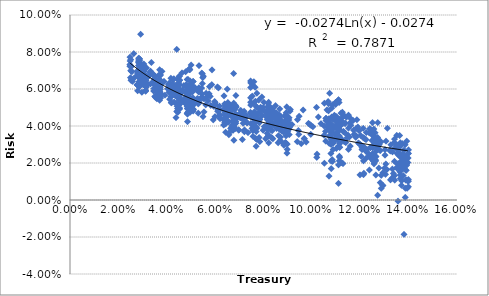
| Category | Series 0 |
|---|---|
| 0.09396559139784944 | 0.032 |
| 0.09403763440860213 | 0.043 |
| 0.09445053763440854 | 0.038 |
| 0.09475215053763439 | 0.045 |
| 0.09560322580645159 | 0.03 |
| 0.09634193548387092 | 0.049 |
| 0.09676881720430103 | 0.033 |
| 0.09692419354838705 | 0.033 |
| 0.09860860215053767 | 0.041 |
| 0.09914032258064519 | 0.041 |
| 0.09952956989247315 | 0.035 |
| 0.10042795698924738 | 0.04 |
| 0.102089247311828 | 0.025 |
| 0.10265591397849466 | 0.045 |
| 0.1051494623655914 | 0.02 |
| 0.10564462365591397 | 0.037 |
| 0.10572150537634405 | 0.032 |
| 0.10627903225806448 | 0.049 |
| 0.10661881720430101 | 0.039 |
| 0.10675215053763439 | 0.053 |
| 0.10717526881720427 | 0.031 |
| 0.10744516129032258 | 0.035 |
| 0.1078010752688172 | 0.037 |
| 0.10794247311827959 | 0.021 |
| 0.10795752688172046 | 0.03 |
| 0.10795376344086022 | 0.033 |
| 0.10794408602150536 | 0.034 |
| 0.10804892473118279 | 0.017 |
| 0.10816559139784947 | 0.04 |
| 0.10846344086021509 | 0.022 |
| 0.10877311827956991 | 0.027 |
| 0.10877311827956991 | 0.031 |
| 0.10900376344086023 | 0.031 |
| 0.10985053763440858 | 0.04 |
| 0.1105806451612903 | 0.034 |
| 0.1105806451612903 | 0.034 |
| 0.11093494623655914 | 0.029 |
| 0.11098064516129033 | 0.041 |
| 0.11098064516129033 | 0.041 |
| 0.11103709677419356 | 0.009 |
| 0.11103709677419356 | 0.019 |
| 0.11117311827956994 | 0.034 |
| 0.11119677419354843 | 0.039 |
| 0.11127903225806456 | 0.032 |
| 0.11136182795698926 | 0.021 |
| 0.11138118279569896 | 0.044 |
| 0.11133387096774199 | 0.024 |
| 0.11126290322580645 | 0.035 |
| 0.11127913978494623 | 0.053 |
| 0.11141290322580642 | 0.043 |
| 0.1115395698924731 | 0.03 |
| 0.1115395698924731 | 0.032 |
| 0.1115579569892473 | 0.028 |
| 0.11148344086021504 | 0.023 |
| 0.11139290322580646 | 0.029 |
| 0.1113468817204301 | 0.034 |
| 0.11133086021505377 | 0.034 |
| 0.11130225806451613 | 0.032 |
| 0.1113751612903226 | 0.038 |
| 0.11201602150537632 | 0.04 |
| 0.1123567741935484 | 0.02 |
| 0.1133904301075269 | 0.032 |
| 0.11402591397849463 | 0.031 |
| 0.1160887096774193 | 0.04 |
| 0.11749021505376339 | 0.036 |
| 0.11825258064516124 | 0.035 |
| 0.11919032258064512 | 0.031 |
| 0.12131913978494621 | 0.014 |
| 0.12131913978494621 | 0.021 |
| 0.12148806451612901 | 0.015 |
| 0.12148806451612901 | 0.029 |
| 0.12378913978494624 | 0.016 |
| 0.12463139784946238 | 0.022 |
| 0.12580430107526883 | 0.034 |
| 0.12605032258064514 | 0.021 |
| 0.12645838709677418 | 0.014 |
| 0.1269874193548387 | 0.033 |
| 0.12722150537634408 | 0.042 |
| 0.12783924731182797 | 0.03 |
| 0.12829451612903225 | 0.009 |
| 0.12829451612903225 | 0.027 |
| 0.12867344086021507 | 0.006 |
| 0.12867344086021507 | 0.013 |
| 0.12936462365591406 | 0.008 |
| 0.12936462365591406 | 0.008 |
| 0.12936462365591406 | 0.015 |
| 0.13022741935483875 | 0.024 |
| 0.130461935483871 | 0.014 |
| 0.13056892473118284 | 0.019 |
| 0.13248827956989254 | 0.011 |
| 0.13264150537634414 | 0.03 |
| 0.1331436559139785 | 0.012 |
| 0.13333290322580646 | 0.026 |
| 0.13367591397849463 | 0.014 |
| 0.13433129032258068 | 0.028 |
| 0.1350533333333333 | 0.017 |
| 0.1350533333333333 | 0.03 |
| 0.1350533333333333 | 0.035 |
| 0.13546677419354836 | 0.02 |
| 0.13562161290322577 | -0.001 |
| 0.13603397849462365 | 0.029 |
| 0.1362990322580645 | 0.017 |
| 0.1364264516129032 | 0.015 |
| 0.13649043010752687 | 0.014 |
| 0.136628064516129 | 0.016 |
| 0.136628064516129 | 0.024 |
| 0.136628064516129 | 0.024 |
| 0.13660010752688168 | 0.031 |
| 0.1366017204301075 | 0.02 |
| 0.1366017204301075 | 0.023 |
| 0.1369936559139784 | 0.021 |
| 0.1371108602150537 | 0.01 |
| 0.13722806451612896 | 0.02 |
| 0.13722806451612896 | 0.023 |
| 0.1375033333333333 | 0.022 |
| 0.1375033333333333 | 0.025 |
| 0.13754903225806447 | 0.017 |
| 0.1380576344086022 | -0.019 |
| 0.1384420430107527 | 0.024 |
| 0.13852752688172046 | 0.03 |
| 0.138567311827957 | 0.001 |
| 0.1386221505376344 | 0.024 |
| 0.13875333333333337 | 0.016 |
| 0.13880225806451615 | 0.011 |
| 0.13880225806451615 | 0.019 |
| 0.13887107526881723 | 0.021 |
| 0.13913666666666671 | 0.02 |
| 0.13917483870967745 | 0.011 |
| 0.13922537634408605 | 0.032 |
| 0.13972000000000007 | 0.02 |
| 0.1398216129032259 | 0.023 |
| 0.13983774193548398 | 0.025 |
| 0.13989419354838717 | 0.01 |
| 0.13991247311827967 | 0.025 |
| 0.1399033333333334 | 0.011 |
| 0.1399033333333334 | 0.027 |
| 0.13989365591397854 | 0.007 |
| 0.13970064516129035 | 0.01 |
| 0.13935548387096777 | 0.006 |
| 0.13921193548387098 | 0.019 |
| 0.1390689247311828 | 0.019 |
| 0.13902698924731183 | 0.016 |
| 0.1389447311827957 | 0.024 |
| 0.13864580645161292 | 0.006 |
| 0.13847913978494625 | 0.022 |
| 0.1380941935483871 | 0.017 |
| 0.13806731182795698 | 0.027 |
| 0.13785924731182794 | 0.018 |
| 0.13785924731182794 | 0.022 |
| 0.1377968817204301 | 0.013 |
| 0.1374796774193548 | 0.031 |
| 0.13707430107526875 | 0.008 |
| 0.13674741935483867 | 0.024 |
| 0.13657591397849458 | 0.012 |
| 0.1363759139784946 | 0.019 |
| 0.13630494623655912 | 0.029 |
| 0.13624473118279568 | 0.035 |
| 0.13590924731182796 | 0.024 |
| 0.13583720430107527 | 0.027 |
| 0.13566784946236557 | 0.019 |
| 0.1354721505376344 | 0.025 |
| 0.13523827956989246 | 0.025 |
| 0.13510494623655914 | 0.017 |
| 0.1342861290322581 | 0.011 |
| 0.13415978494623657 | 0.013 |
| 0.13415978494623657 | 0.021 |
| 0.13415978494623657 | 0.031 |
| 0.13415978494623657 | 0.033 |
| 0.1340183870967742 | 0.031 |
| 0.13327591397849464 | 0.017 |
| 0.13253075268817202 | 0.026 |
| 0.13216731182795702 | 0.027 |
| 0.13118989247311832 | 0.039 |
| 0.13101731182795706 | 0.016 |
| 0.13065064516129035 | 0.032 |
| 0.13024258064516134 | 0.027 |
| 0.13001946236559145 | 0.017 |
| 0.1285581720430108 | 0.031 |
| 0.12785118279569896 | 0.027 |
| 0.12767322580645166 | 0.017 |
| 0.12767322580645166 | 0.033 |
| 0.12721247311827963 | 0.003 |
| 0.12721247311827963 | 0.028 |
| 0.12721247311827963 | 0.028 |
| 0.12721247311827963 | 0.029 |
| 0.12721247311827963 | 0.033 |
| 0.12721247311827963 | 0.034 |
| 0.12675924731182797 | 0.027 |
| 0.12626569892473122 | 0.031 |
| 0.12577860215053766 | 0.034 |
| 0.1256151612903226 | 0.038 |
| 0.12515602150537636 | 0.037 |
| 0.1250167741935484 | 0.025 |
| 0.12485655913978497 | 0.032 |
| 0.12416731182795698 | 0.028 |
| 0.12416731182795698 | 0.028 |
| 0.12399580645161286 | 0.039 |
| 0.12399580645161286 | 0.039 |
| 0.1225065591397849 | 0.036 |
| 0.12235279569892468 | 0.033 |
| 0.12177591397849455 | 0.028 |
| 0.12125279569892464 | 0.034 |
| 0.12125279569892464 | 0.039 |
| 0.12071516129032252 | 0.028 |
| 0.1205872043010752 | 0.029 |
| 0.11967215053763434 | 0.03 |
| 0.11832322580645155 | 0.039 |
| 0.11781354838709668 | 0.035 |
| 0.11610494623655905 | 0.044 |
| 0.11554311827956981 | 0.034 |
| 0.11516086021505367 | 0.039 |
| 0.11516086021505367 | 0.046 |
| 0.11496569892473109 | 0.035 |
| 0.11287806451612897 | 0.02 |
| 0.1108259139784946 | 0.04 |
| 0.11051569892473116 | 0.043 |
| 0.10986731182795702 | 0.045 |
| 0.10890709677419359 | 0.04 |
| 0.1083018817204302 | 0.032 |
| 0.1081443010752689 | 0.037 |
| 0.10794139784946243 | 0.037 |
| 0.10779505376344091 | 0.041 |
| 0.10729258064516135 | 0.034 |
| 0.10729258064516135 | 0.058 |
| 0.10706639784946244 | 0.038 |
| 0.10695215053763445 | 0.041 |
| 0.10695215053763445 | 0.052 |
| 0.10691349462365597 | 0.041 |
| 0.10688301075268822 | 0.043 |
| 0.10685973118279574 | 0.048 |
| 0.10703715053763442 | 0.043 |
| 0.10703715053763442 | 0.044 |
| 0.10814 | 0.045 |
| 0.10820096774193548 | 0.05 |
| 0.10851983870967742 | 0.051 |
| 0.10867994623655913 | 0.039 |
| 0.10867994623655913 | 0.044 |
| 0.10895048387096774 | 0.039 |
| 0.10927994623655915 | 0.046 |
| 0.10960876344086021 | 0.035 |
| 0.10971489247311826 | 0.033 |
| 0.1098221505376344 | 0.052 |
| 0.1098221505376344 | 0.053 |
| 0.1098221505376344 | 0.053 |
| 0.11024279569892476 | 0.045 |
| 0.1104378494623656 | 0.042 |
| 0.1106521505376344 | 0.037 |
| 0.11069473118279567 | 0.038 |
| 0.11069473118279567 | 0.043 |
| 0.11101967741935483 | 0.037 |
| 0.11101967741935483 | 0.054 |
| 0.11101967741935483 | 0.054 |
| 0.11172736559139783 | 0.033 |
| 0.11206607526881714 | 0.047 |
| 0.1121313978494623 | 0.041 |
| 0.1121945161290322 | 0.033 |
| 0.1121945161290322 | 0.043 |
| 0.11261064516129024 | 0.041 |
| 0.11261064516129024 | 0.047 |
| 0.11273779569892466 | 0.045 |
| 0.11298408602150531 | 0.037 |
| 0.1130496774193548 | 0.037 |
| 0.11344779569892469 | 0.046 |
| 0.11365569892473114 | 0.041 |
| 0.11385806451612901 | 0.041 |
| 0.11424043010752685 | 0.045 |
| 0.11515704301075266 | 0.027 |
| 0.11585403225806452 | 0.029 |
| 0.1170204301075269 | 0.043 |
| 0.11729591397849459 | 0.038 |
| 0.11814333333333325 | 0.034 |
| 0.11859752688172027 | 0.043 |
| 0.1190339784946235 | 0.039 |
| 0.11989930107526872 | 0.014 |
| 0.11999048387096764 | 0.03 |
| 0.1203923118279569 | 0.024 |
| 0.12187559139784936 | 0.033 |
| 0.12374500000000002 | 0.036 |
| 0.1250882795698925 | 0.042 |
| 0.1251630107526882 | 0.028 |
| 0.12541596774193556 | 0.023 |
| 0.1254927419354839 | 0.021 |
| 0.1256723655913979 | 0.02 |
| 0.12571951612903232 | 0.022 |
| 0.12580419354838715 | 0.03 |
| 0.12602795698924737 | 0.03 |
| 0.12602795698924737 | 0.033 |
| 0.12617365591397856 | 0.036 |
| 0.12627672043010757 | 0.022 |
| 0.12637241935483876 | 0.021 |
| 0.12640064516129035 | 0.029 |
| 0.1265313978494624 | 0.023 |
| 0.12651817204301075 | 0.028 |
| 0.12643897849462363 | 0.024 |
| 0.12630161290322578 | 0.033 |
| 0.12602005376344083 | 0.029 |
| 0.12547505376344087 | 0.025 |
| 0.12535381720430108 | 0.025 |
| 0.12507301075268812 | 0.032 |
| 0.12507301075268812 | 0.037 |
| 0.12496930107526878 | 0.035 |
| 0.12368913978494624 | 0.024 |
| 0.12322650537634408 | 0.025 |
| 0.12264811827956988 | 0.027 |
| 0.12242532258064516 | 0.023 |
| 0.12242532258064516 | 0.026 |
| 0.12153290322580648 | 0.033 |
| 0.12076252688172048 | 0.027 |
| 0.12013881720430113 | 0.035 |
| 0.11955005376344088 | 0.037 |
| 0.11578150537634413 | 0.042 |
| 0.11457193548387096 | 0.034 |
| 0.11381080645161293 | 0.036 |
| 0.11258682795698925 | 0.032 |
| 0.11108693548387094 | 0.034 |
| 0.11102290322580645 | 0.033 |
| 0.11067672043010753 | 0.042 |
| 0.11031629032258061 | 0.043 |
| 0.11020870967741933 | 0.035 |
| 0.11014870967741931 | 0.028 |
| 0.11014870967741931 | 0.035 |
| 0.10909715053763439 | 0.043 |
| 0.10853327956989244 | 0.021 |
| 0.10806607526881722 | 0.041 |
| 0.10785451612903227 | 0.025 |
| 0.10708467741935485 | 0.013 |
| 0.10674424731182794 | 0.042 |
| 0.1058410752688172 | 0.043 |
| 0.1058410752688172 | 0.044 |
| 0.1058410752688172 | 0.044 |
| 0.10519370967741934 | 0.052 |
| 0.10506446236559137 | 0.035 |
| 0.10506446236559137 | 0.04 |
| 0.1037359677419354 | 0.041 |
| 0.10199666666666657 | 0.023 |
| 0.10189473118279559 | 0.05 |
| 0.09974822580645154 | 0.04 |
| 0.09760731182795698 | 0.031 |
| 0.09460268817204295 | 0.035 |
| 0.0917422580645161 | 0.041 |
| 0.09110494623655907 | 0.049 |
| 0.09096145161290317 | 0.048 |
| 0.0906837096774193 | 0.039 |
| 0.08962736559139782 | 0.05 |
| 0.0892927956989247 | 0.046 |
| 0.08758500000000002 | 0.031 |
| 0.08574967741935483 | 0.04 |
| 0.08374317204301075 | 0.049 |
| 0.08212322580645158 | 0.053 |
| 0.08013344086021504 | 0.053 |
| 0.07897575268817204 | 0.049 |
| 0.07663725806451614 | 0.053 |
| 0.07654967741935484 | 0.061 |
| 0.07602403225806452 | 0.064 |
| 0.07558129032258065 | 0.062 |
| 0.07535268817204303 | 0.056 |
| 0.0747119892473119 | 0.063 |
| 0.07467064516129038 | 0.064 |
| 0.07469677419354845 | 0.053 |
| 0.07468166666666674 | 0.061 |
| 0.07467559139784953 | 0.047 |
| 0.07470580645161297 | 0.051 |
| 0.07470053763440863 | 0.045 |
| 0.07463489247311829 | 0.047 |
| 0.07467161290322581 | 0.055 |
| 0.07599962365591398 | 0.053 |
| 0.07728236559139787 | 0.058 |
| 0.07805145161290322 | 0.054 |
| 0.0785015053763441 | 0.047 |
| 0.07882903225806451 | 0.05 |
| 0.07935569892473118 | 0.056 |
| 0.08089295698924726 | 0.033 |
| 0.08278715053763436 | 0.047 |
| 0.08552999999999998 | 0.04 |
| 0.08552999999999998 | 0.044 |
| 0.08681215053763439 | 0.041 |
| 0.08688516129032255 | 0.041 |
| 0.08741446236559137 | 0.038 |
| 0.08821021505376345 | 0.037 |
| 0.08910295698924728 | 0.031 |
| 0.08945467741935481 | 0.039 |
| 0.08945467741935481 | 0.043 |
| 0.08990129032258061 | 0.042 |
| 0.08994215053763438 | 0.038 |
| 0.08994951612903225 | 0.042 |
| 0.08988559139784946 | 0.036 |
| 0.08948720430107529 | 0.041 |
| 0.09015392473118285 | 0.042 |
| 0.08995086021505382 | 0.045 |
| 0.08982881720430111 | 0.027 |
| 0.08967709677419358 | 0.025 |
| 0.08944913978494624 | 0.038 |
| 0.08928193548387096 | 0.031 |
| 0.08899419354838708 | 0.031 |
| 0.08894752688172042 | 0.045 |
| 0.0890326344086021 | 0.038 |
| 0.08930301075268814 | 0.04 |
| 0.0893269892473118 | 0.035 |
| 0.08933978494623654 | 0.047 |
| 0.08936397849462362 | 0.043 |
| 0.08932258064516126 | 0.042 |
| 0.08937548387096769 | 0.039 |
| 0.08941962365591394 | 0.043 |
| 0.08944618279569887 | 0.046 |
| 0.08946774193548382 | 0.04 |
| 0.08949333333333327 | 0.041 |
| 0.08979274193548382 | 0.03 |
| 0.09015801075268814 | 0.037 |
| 0.09051607526881719 | 0.039 |
| 0.09053870967741934 | 0.038 |
| 0.09055301075268814 | 0.044 |
| 0.09064182795698923 | 0.035 |
| 0.09062392473118279 | 0.039 |
| 0.09049220430107523 | 0.043 |
| 0.09036806451612903 | 0.04 |
| 0.09041392473118286 | 0.04 |
| 0.08962446236559142 | 0.045 |
| 0.08838827956989245 | 0.03 |
| 0.08822123655913977 | 0.04 |
| 0.0880546236559139 | 0.042 |
| 0.08756881720430106 | 0.037 |
| 0.08725951612903218 | 0.041 |
| 0.0872070967741935 | 0.042 |
| 0.08622736559139779 | 0.035 |
| 0.08573483870967738 | 0.044 |
| 0.08541736559139781 | 0.039 |
| 0.08537629032258061 | 0.047 |
| 0.08528854838709674 | 0.044 |
| 0.08494623655913976 | 0.051 |
| 0.08476349462365589 | 0.045 |
| 0.08476349462365589 | 0.047 |
| 0.0845115591397849 | 0.041 |
| 0.0845115591397849 | 0.045 |
| 0.083658064516129 | 0.044 |
| 0.08317451612903223 | 0.049 |
| 0.08274333333333332 | 0.047 |
| 0.0825395698924731 | 0.046 |
| 0.08247725806451611 | 0.046 |
| 0.08247725806451611 | 0.047 |
| 0.08229827956989247 | 0.043 |
| 0.08185833333333334 | 0.048 |
| 0.08157172043010753 | 0.043 |
| 0.08138360215053762 | 0.04 |
| 0.08146870967741932 | 0.047 |
| 0.08157580645161289 | 0.048 |
| 0.08174602150537634 | 0.04 |
| 0.08185822580645159 | 0.051 |
| 0.08241758064516128 | 0.042 |
| 0.08312591397849459 | 0.041 |
| 0.08328435483870963 | 0.049 |
| 0.08342586021505373 | 0.046 |
| 0.08347037634408598 | 0.049 |
| 0.08358344086021505 | 0.037 |
| 0.08386193548387097 | 0.033 |
| 0.08531725806451614 | 0.04 |
| 0.08531725806451614 | 0.04 |
| 0.08584596774193547 | 0.039 |
| 0.08601913978494623 | 0.041 |
| 0.086128064516129 | 0.039 |
| 0.08652473118279573 | 0.043 |
| 0.08683177419354844 | 0.032 |
| 0.08700161290322582 | 0.042 |
| 0.08705215053763445 | 0.045 |
| 0.08704623655913982 | 0.043 |
| 0.08702790322580647 | 0.034 |
| 0.08702790322580647 | 0.038 |
| 0.08697838709677425 | 0.041 |
| 0.08697198924731186 | 0.041 |
| 0.08675817204301081 | 0.044 |
| 0.0867199462365592 | 0.038 |
| 0.08670715053763446 | 0.038 |
| 0.08670715053763446 | 0.043 |
| 0.08670715053763446 | 0.049 |
| 0.08659263440860217 | 0.044 |
| 0.08631747311827957 | 0.046 |
| 0.08604252688172047 | 0.031 |
| 0.0855513978494624 | 0.041 |
| 0.0855513978494624 | 0.042 |
| 0.08511403225806455 | 0.045 |
| 0.08474456989247313 | 0.04 |
| 0.08474456989247313 | 0.045 |
| 0.08340994623655915 | 0.034 |
| 0.08334720430107528 | 0.042 |
| 0.08331381720430107 | 0.034 |
| 0.0830311827956989 | 0.038 |
| 0.0830311827956989 | 0.04 |
| 0.08301559139784943 | 0.046 |
| 0.08274887096774189 | 0.04 |
| 0.08260801075268813 | 0.05 |
| 0.08229209677419357 | 0.043 |
| 0.0822625806451613 | 0.042 |
| 0.08217150537634409 | 0.031 |
| 0.08209048387096772 | 0.035 |
| 0.0820238709677419 | 0.052 |
| 0.08197962365591395 | 0.047 |
| 0.0819671505376344 | 0.046 |
| 0.08176666666666665 | 0.034 |
| 0.08176666666666665 | 0.038 |
| 0.08175048387096773 | 0.045 |
| 0.08159629032258062 | 0.045 |
| 0.08153973118279569 | 0.036 |
| 0.08135134408602152 | 0.045 |
| 0.08135134408602152 | 0.047 |
| 0.08109564516129032 | 0.04 |
| 0.08050413978494622 | 0.048 |
| 0.08029903225806452 | 0.04 |
| 0.07996306451612906 | 0.05 |
| 0.07982005376344088 | 0.038 |
| 0.07941376344086022 | 0.046 |
| 0.07862220430107526 | 0.049 |
| 0.07848752688172042 | 0.044 |
| 0.07847645161290323 | 0.032 |
| 0.0782883870967742 | 0.042 |
| 0.07818817204301076 | 0.034 |
| 0.07788306451612902 | 0.043 |
| 0.07752419354838705 | 0.047 |
| 0.07722731182795699 | 0.039 |
| 0.07717956989247313 | 0.045 |
| 0.07714559139784946 | 0.05 |
| 0.07707403225806453 | 0.039 |
| 0.07705424731182796 | 0.045 |
| 0.07704311827956987 | 0.05 |
| 0.07703451612903224 | 0.037 |
| 0.07696301075268816 | 0.029 |
| 0.07674370967741938 | 0.033 |
| 0.07674370967741938 | 0.043 |
| 0.07660951612903232 | 0.042 |
| 0.07634747311827962 | 0.043 |
| 0.07623338709677425 | 0.047 |
| 0.07623338709677425 | 0.048 |
| 0.0760665053763441 | 0.044 |
| 0.07604161290322581 | 0.044 |
| 0.07583338709677422 | 0.044 |
| 0.07583338709677422 | 0.044 |
| 0.07526650537634412 | 0.039 |
| 0.07472870967741939 | 0.041 |
| 0.07269623655913977 | 0.045 |
| 0.07253639784946235 | 0.042 |
| 0.07253639784946235 | 0.045 |
| 0.07200064516129029 | 0.048 |
| 0.0719536021505376 | 0.043 |
| 0.07162709677419353 | 0.046 |
| 0.07059655913978495 | 0.047 |
| 0.07059655913978495 | 0.048 |
| 0.07049043010752688 | 0.045 |
| 0.07026048387096774 | 0.045 |
| 0.06969279569892473 | 0.038 |
| 0.06913446236559137 | 0.046 |
| 0.06878075268817203 | 0.05 |
| 0.06870677419354838 | 0.044 |
| 0.06870677419354838 | 0.046 |
| 0.06735392473118279 | 0.038 |
| 0.0671933870967742 | 0.043 |
| 0.06711774193548387 | 0.049 |
| 0.0666837634408602 | 0.048 |
| 0.06646553763440859 | 0.046 |
| 0.06638715053763439 | 0.051 |
| 0.06596575268817204 | 0.05 |
| 0.06577134408602149 | 0.049 |
| 0.06570247311827956 | 0.035 |
| 0.06570247311827956 | 0.036 |
| 0.06570247311827956 | 0.047 |
| 0.06558247311827957 | 0.042 |
| 0.0652631182795699 | 0.053 |
| 0.06504397849462368 | 0.06 |
| 0.0649728494623656 | 0.045 |
| 0.06488779569892474 | 0.05 |
| 0.06452301075268815 | 0.041 |
| 0.06452301075268815 | 0.047 |
| 0.0644202688172043 | 0.049 |
| 0.06437553763440859 | 0.046 |
| 0.06433193548387096 | 0.037 |
| 0.06408290322580644 | 0.051 |
| 0.06400752688172043 | 0.046 |
| 0.06367349462365592 | 0.056 |
| 0.06348000000000001 | 0.041 |
| 0.06331537634408602 | 0.044 |
| 0.06344231182795698 | 0.049 |
| 0.0639048387096774 | 0.046 |
| 0.06638397849462367 | 0.039 |
| 0.06677333333333335 | 0.039 |
| 0.06837021505376348 | 0.039 |
| 0.07210107526881718 | 0.037 |
| 0.07210107526881718 | 0.038 |
| 0.0726209139784946 | 0.046 |
| 0.07321731182795696 | 0.042 |
| 0.07321731182795696 | 0.042 |
| 0.07357456989247307 | 0.036 |
| 0.07525129032258059 | 0.046 |
| 0.07553876344086018 | 0.037 |
| 0.07566397849462363 | 0.034 |
| 0.07593236559139782 | 0.039 |
| 0.07593236559139782 | 0.041 |
| 0.07602989247311824 | 0.042 |
| 0.07612043010752684 | 0.039 |
| 0.07623408602150533 | 0.039 |
| 0.0771681182795699 | 0.033 |
| 0.07155564516129036 | 0.041 |
| 0.07127145161290327 | 0.033 |
| 0.07055645161290328 | 0.044 |
| 0.069792688172043 | 0.038 |
| 0.06857397849462363 | 0.056 |
| 0.06850102150537632 | 0.042 |
| 0.06850102150537632 | 0.044 |
| 0.06804231182795696 | 0.041 |
| 0.06797268817204298 | 0.046 |
| 0.06762682795698922 | 0.068 |
| 0.06671591397849459 | 0.046 |
| 0.06644306451612901 | 0.05 |
| 0.064523064516129 | 0.048 |
| 0.06398322580645156 | 0.052 |
| 0.06404666666666667 | 0.047 |
| 0.06402827956989249 | 0.041 |
| 0.06402043010752691 | 0.044 |
| 0.06397763440860214 | 0.042 |
| 0.06402451612903226 | 0.046 |
| 0.06403489247311829 | 0.048 |
| 0.06494553763440863 | 0.048 |
| 0.06544849462365593 | 0.047 |
| 0.06774817204301081 | 0.032 |
| 0.06846252688172044 | 0.045 |
| 0.06860994623655911 | 0.044 |
| 0.06859741935483869 | 0.044 |
| 0.06856602150537632 | 0.041 |
| 0.06848225806451612 | 0.051 |
| 0.06847317204301075 | 0.047 |
| 0.06829021505376343 | 0.045 |
| 0.06827876344086023 | 0.044 |
| 0.06827833333333334 | 0.044 |
| 0.06821064516129031 | 0.042 |
| 0.06821064516129031 | 0.05 |
| 0.06810102150537635 | 0.05 |
| 0.06785370967741934 | 0.04 |
| 0.06806016129032258 | 0.049 |
| 0.0676970430107527 | 0.052 |
| 0.06702516129032256 | 0.04 |
| 0.06696924731182793 | 0.046 |
| 0.06528897849462367 | 0.042 |
| 0.06102258064516128 | 0.048 |
| 0.060954139784946224 | 0.061 |
| 0.05938279569892474 | 0.051 |
| 0.058185000000000014 | 0.051 |
| 0.05797016129032259 | 0.056 |
| 0.057693602150537635 | 0.061 |
| 0.057036344086021505 | 0.054 |
| 0.056293655913978474 | 0.058 |
| 0.055145860215053764 | 0.067 |
| 0.054894193548387094 | 0.066 |
| 0.053143978494623684 | 0.058 |
| 0.053080537634408606 | 0.053 |
| 0.053080537634408606 | 0.053 |
| 0.0535527419354839 | 0.059 |
| 0.0592094086021506 | 0.043 |
| 0.059961612903225846 | 0.045 |
| 0.0616427956989248 | 0.045 |
| 0.061986129032258114 | 0.044 |
| 0.06195215053763439 | 0.046 |
| 0.06183795698924727 | 0.049 |
| 0.0618046774193548 | 0.051 |
| 0.06146833333333329 | 0.049 |
| 0.06142258064516126 | 0.061 |
| 0.06111650537634405 | 0.049 |
| 0.06001521505376347 | 0.052 |
| 0.05992795698924733 | 0.052 |
| 0.059761612903225826 | 0.053 |
| 0.05868924731182799 | 0.07 |
| 0.05863489247311832 | 0.062 |
| 0.057515698924731185 | 0.057 |
| 0.05661510752688173 | 0.056 |
| 0.05612827956989245 | 0.051 |
| 0.055393279569892456 | 0.048 |
| 0.055393279569892456 | 0.055 |
| 0.05496924731182798 | 0.045 |
| 0.054695322580645155 | 0.055 |
| 0.054669516129032245 | 0.055 |
| 0.054410107526881704 | 0.061 |
| 0.05444947849462365 | 0.056 |
| 0.05474660215053765 | 0.063 |
| 0.05476067741935485 | 0.068 |
| 0.05485070967741932 | 0.055 |
| 0.05451315591397848 | 0.057 |
| 0.05447420967741934 | 0.069 |
| 0.053448876344086065 | 0.06 |
| 0.053404715053763464 | 0.053 |
| 0.05335969354838712 | 0.073 |
| 0.0532826666666667 | 0.061 |
| 0.05325021505376346 | 0.054 |
| 0.053006666666666695 | 0.047 |
| 0.053006666666666695 | 0.052 |
| 0.052638763440860235 | 0.055 |
| 0.05182809139784946 | 0.06 |
| 0.05161554301075267 | 0.061 |
| 0.05002896236559141 | 0.073 |
| 0.04982679569892475 | 0.05 |
| 0.04969709139784947 | 0.064 |
| 0.049491010752688164 | 0.071 |
| 0.04922081182795698 | 0.071 |
| 0.04883926344086024 | 0.065 |
| 0.048650709677419385 | 0.062 |
| 0.047985043010752675 | 0.062 |
| 0.04795251075268817 | 0.062 |
| 0.047806994623655896 | 0.069 |
| 0.04813189247311825 | 0.054 |
| 0.04845711827956986 | 0.051 |
| 0.048501161290322566 | 0.054 |
| 0.048654629032258034 | 0.057 |
| 0.048714107526881704 | 0.056 |
| 0.048714107526881704 | 0.058 |
| 0.04881562903225804 | 0.061 |
| 0.04883295161290321 | 0.053 |
| 0.04883295161290321 | 0.059 |
| 0.04894772580645161 | 0.057 |
| 0.04933358602150536 | 0.056 |
| 0.04939883333333333 | 0.056 |
| 0.04940081720430106 | 0.071 |
| 0.04940081720430106 | 0.071 |
| 0.04952354838709677 | 0.053 |
| 0.04952354838709677 | 0.07 |
| 0.049875876344086044 | 0.063 |
| 0.05052888709677421 | 0.058 |
| 0.05052888709677421 | 0.058 |
| 0.050607306451612925 | 0.049 |
| 0.050664951612903235 | 0.062 |
| 0.05102477419354839 | 0.054 |
| 0.05102187634408603 | 0.049 |
| 0.05103830107526881 | 0.051 |
| 0.05102511827956993 | 0.054 |
| 0.05102511827956993 | 0.054 |
| 0.05100484408602153 | 0.053 |
| 0.05093682258064519 | 0.054 |
| 0.05087818817204304 | 0.052 |
| 0.05087818817204304 | 0.054 |
| 0.050830456989247305 | 0.051 |
| 0.05083345698924732 | 0.055 |
| 0.050916021505376365 | 0.048 |
| 0.050908849462365596 | 0.064 |
| 0.050899725806451614 | 0.064 |
| 0.05086755376344086 | 0.052 |
| 0.04945527956989247 | 0.054 |
| 0.04860090322580647 | 0.061 |
| 0.048332381720430126 | 0.058 |
| 0.047992032258064525 | 0.062 |
| 0.047648263440860227 | 0.052 |
| 0.04712588172043013 | 0.055 |
| 0.04707170430107528 | 0.062 |
| 0.046521005376344064 | 0.058 |
| 0.04632551612903225 | 0.069 |
| 0.04598174193548387 | 0.058 |
| 0.04531245698924735 | 0.049 |
| 0.04517239247311832 | 0.06 |
| 0.04515994623655918 | 0.054 |
| 0.04515994623655918 | 0.062 |
| 0.0451434784946237 | 0.059 |
| 0.04526680107526883 | 0.057 |
| 0.045300344086021516 | 0.052 |
| 0.0453315053763441 | 0.055 |
| 0.04528687634408602 | 0.052 |
| 0.045281569892473124 | 0.065 |
| 0.04524151075268819 | 0.056 |
| 0.04523739784946239 | 0.059 |
| 0.04523739784946239 | 0.065 |
| 0.04523053763440862 | 0.057 |
| 0.04523053763440862 | 0.065 |
| 0.045192559139784955 | 0.055 |
| 0.04516195161290323 | 0.065 |
| 0.04516117204301077 | 0.067 |
| 0.04516117204301077 | 0.067 |
| 0.04522961827956989 | 0.06 |
| 0.045312005376344104 | 0.05 |
| 0.046512000000000005 | 0.059 |
| 0.04865392473118278 | 0.047 |
| 0.04865392473118278 | 0.051 |
| 0.0493318709677419 | 0.061 |
| 0.04937030107526878 | 0.058 |
| 0.04959354301075269 | 0.048 |
| 0.04969098924731187 | 0.047 |
| 0.04975644623655918 | 0.05 |
| 0.04980356451612905 | 0.06 |
| 0.0497365860215054 | 0.052 |
| 0.04946686559139786 | 0.055 |
| 0.04943032258064517 | 0.061 |
| 0.04939027956989249 | 0.06 |
| 0.04927710752688173 | 0.059 |
| 0.04920252150537634 | 0.051 |
| 0.04906583870967743 | 0.055 |
| 0.048539956989247325 | 0.052 |
| 0.04842703225806452 | 0.054 |
| 0.04840126881720431 | 0.065 |
| 0.04837480645161289 | 0.057 |
| 0.048279403225806435 | 0.052 |
| 0.0481539569892473 | 0.059 |
| 0.04842946774193548 | 0.047 |
| 0.04842946774193548 | 0.053 |
| 0.04845029032258064 | 0.054 |
| 0.048577870967741944 | 0.046 |
| 0.0487046989247312 | 0.055 |
| 0.04878089247311829 | 0.053 |
| 0.049126263440860234 | 0.056 |
| 0.04915190860215054 | 0.048 |
| 0.049130548387096774 | 0.051 |
| 0.04916769354838709 | 0.048 |
| 0.049164236559139776 | 0.056 |
| 0.049120053763440835 | 0.056 |
| 0.04907481720430105 | 0.047 |
| 0.04894948924731181 | 0.051 |
| 0.048925827956989236 | 0.05 |
| 0.04885246236559138 | 0.051 |
| 0.048820666666666644 | 0.06 |
| 0.04866257526881719 | 0.059 |
| 0.0486321935483871 | 0.055 |
| 0.048610634408602145 | 0.049 |
| 0.048610634408602145 | 0.049 |
| 0.048610634408602145 | 0.053 |
| 0.048575387096774184 | 0.042 |
| 0.04831278494623655 | 0.059 |
| 0.04812731720430108 | 0.059 |
| 0.04812731720430108 | 0.059 |
| 0.04774636021505379 | 0.052 |
| 0.04774636021505379 | 0.054 |
| 0.0475682365591398 | 0.054 |
| 0.046270247311827946 | 0.054 |
| 0.04531094623655912 | 0.06 |
| 0.04520415053763437 | 0.055 |
| 0.04515966666666663 | 0.055 |
| 0.044977096774193516 | 0.062 |
| 0.044977096774193516 | 0.063 |
| 0.04504485483870967 | 0.057 |
| 0.04500119892473118 | 0.057 |
| 0.044795064516129024 | 0.062 |
| 0.044805236559139774 | 0.062 |
| 0.044805236559139774 | 0.062 |
| 0.044805236559139774 | 0.062 |
| 0.044787994623655916 | 0.057 |
| 0.04476559677419354 | 0.058 |
| 0.04472765053763441 | 0.057 |
| 0.044676994623655916 | 0.056 |
| 0.044613182795698925 | 0.061 |
| 0.044613182795698925 | 0.061 |
| 0.044176978494623625 | 0.061 |
| 0.044176978494623625 | 0.061 |
| 0.044176978494623625 | 0.061 |
| 0.04413615053763438 | 0.061 |
| 0.04375044086021502 | 0.06 |
| 0.04257465591397846 | 0.057 |
| 0.04239015591397846 | 0.059 |
| 0.042300532258064474 | 0.06 |
| 0.04135601075268814 | 0.063 |
| 0.04033497849462364 | 0.06 |
| 0.038883215053763465 | 0.064 |
| 0.03831693010752691 | 0.063 |
| 0.038028435483871 | 0.069 |
| 0.03706880107526883 | 0.07 |
| 0.036954274193548395 | 0.065 |
| 0.03698722580645162 | 0.058 |
| 0.037042763440860216 | 0.064 |
| 0.03726611290322581 | 0.063 |
| 0.03734419892473119 | 0.065 |
| 0.03735458602150538 | 0.056 |
| 0.03745723118279571 | 0.055 |
| 0.03745723118279571 | 0.068 |
| 0.04092088709677419 | 0.063 |
| 0.041119102150537636 | 0.06 |
| 0.041194473118279576 | 0.06 |
| 0.041194473118279576 | 0.06 |
| 0.04128031720430109 | 0.058 |
| 0.041882913978494626 | 0.053 |
| 0.042461903225806466 | 0.063 |
| 0.04256476881720432 | 0.065 |
| 0.04261395698924734 | 0.06 |
| 0.04266023118279572 | 0.061 |
| 0.04266023118279572 | 0.061 |
| 0.04266023118279572 | 0.062 |
| 0.04275453225806453 | 0.059 |
| 0.04275453225806453 | 0.061 |
| 0.042957704301075275 | 0.066 |
| 0.043007521505376345 | 0.061 |
| 0.04344923118279571 | 0.059 |
| 0.043697188172043024 | 0.059 |
| 0.043697188172043024 | 0.06 |
| 0.043744118279569914 | 0.06 |
| 0.04393940860215056 | 0.056 |
| 0.044011333333333326 | 0.061 |
| 0.044021693548387086 | 0.052 |
| 0.04419016666666666 | 0.057 |
| 0.04432086021505377 | 0.063 |
| 0.04433372043010755 | 0.051 |
| 0.044352994623655925 | 0.057 |
| 0.044421602150537656 | 0.059 |
| 0.04455218817204303 | 0.047 |
| 0.04455218817204303 | 0.049 |
| 0.04455218817204303 | 0.049 |
| 0.04461706989247311 | 0.061 |
| 0.044607709677419345 | 0.056 |
| 0.04457862903225807 | 0.065 |
| 0.0445824569892473 | 0.055 |
| 0.04459642473118278 | 0.058 |
| 0.04411491935483871 | 0.081 |
| 0.04399750537634409 | 0.057 |
| 0.04306684408602151 | 0.053 |
| 0.04306684408602151 | 0.057 |
| 0.04306684408602151 | 0.057 |
| 0.04306684408602151 | 0.06 |
| 0.0419818064516129 | 0.062 |
| 0.041718650537634405 | 0.056 |
| 0.041718650537634405 | 0.056 |
| 0.04168682258064515 | 0.066 |
| 0.04143336559139785 | 0.061 |
| 0.04124242473118279 | 0.059 |
| 0.041192537634408596 | 0.054 |
| 0.041192537634408596 | 0.06 |
| 0.041155784946236555 | 0.061 |
| 0.041107086021505375 | 0.062 |
| 0.041073688172043016 | 0.06 |
| 0.04105409139784946 | 0.06 |
| 0.04099629032258065 | 0.058 |
| 0.04086113440860215 | 0.063 |
| 0.04083034946236559 | 0.062 |
| 0.04082346236559141 | 0.062 |
| 0.041615430107526885 | 0.059 |
| 0.04200572043010752 | 0.052 |
| 0.042360736559139786 | 0.058 |
| 0.04320301612903224 | 0.062 |
| 0.043619865591397834 | 0.056 |
| 0.0437871397849462 | 0.045 |
| 0.04408878494623654 | 0.048 |
| 0.04323955376344087 | 0.058 |
| 0.03926768817204303 | 0.057 |
| 0.0375580430107527 | 0.057 |
| 0.037120876344086014 | 0.063 |
| 0.036953274193548394 | 0.067 |
| 0.035883247311827945 | 0.055 |
| 0.035883247311827945 | 0.059 |
| 0.035883247311827945 | 0.059 |
| 0.03521843548387097 | 0.067 |
| 0.034814817204301074 | 0.065 |
| 0.03153715591397849 | 0.063 |
| 0.03153715591397849 | 0.066 |
| 0.03129904838709677 | 0.067 |
| 0.03095525268817204 | 0.065 |
| 0.03090409139784946 | 0.066 |
| 0.030613860215053752 | 0.072 |
| 0.030531752688172032 | 0.073 |
| 0.030518161290322563 | 0.065 |
| 0.030360569892473103 | 0.067 |
| 0.02921232258064518 | 0.074 |
| 0.029188134408602167 | 0.066 |
| 0.029149166666666677 | 0.064 |
| 0.029149166666666677 | 0.07 |
| 0.029149166666666677 | 0.071 |
| 0.029139021505376353 | 0.065 |
| 0.02905790322580648 | 0.072 |
| 0.0290365107526882 | 0.074 |
| 0.02883519892473121 | 0.071 |
| 0.028789236559139817 | 0.075 |
| 0.028789236559139817 | 0.076 |
| 0.0286537795698925 | 0.071 |
| 0.0286537795698925 | 0.076 |
| 0.028352413978494632 | 0.067 |
| 0.028352413978494632 | 0.073 |
| 0.028352413978494632 | 0.074 |
| 0.028352413978494632 | 0.075 |
| 0.028352413978494632 | 0.076 |
| 0.028352413978494632 | 0.077 |
| 0.028291360215053782 | 0.07 |
| 0.02861631720430107 | 0.067 |
| 0.028943962365591387 | 0.064 |
| 0.029168129032258062 | 0.069 |
| 0.029569075268817205 | 0.068 |
| 0.029637946236559135 | 0.063 |
| 0.030150408602150545 | 0.064 |
| 0.030231897849462376 | 0.063 |
| 0.030231897849462376 | 0.063 |
| 0.03040447849462367 | 0.068 |
| 0.03326419892473118 | 0.063 |
| 0.03423510752688171 | 0.068 |
| 0.034418806451612896 | 0.064 |
| 0.034455768817204295 | 0.068 |
| 0.0346866129032258 | 0.06 |
| 0.034991833333333326 | 0.067 |
| 0.035233241935483856 | 0.061 |
| 0.03527579569892471 | 0.062 |
| 0.03531835483870966 | 0.065 |
| 0.035361720430107504 | 0.055 |
| 0.03550509677419352 | 0.062 |
| 0.03576205913978492 | 0.064 |
| 0.03658934946236556 | 0.06 |
| 0.03663044623655911 | 0.055 |
| 0.037169801075268794 | 0.056 |
| 0.037193930107526856 | 0.061 |
| 0.03727195698924728 | 0.058 |
| 0.03736690322580643 | 0.06 |
| 0.037305086021505396 | 0.058 |
| 0.037292623655914 | 0.061 |
| 0.03707583870967745 | 0.054 |
| 0.03707583870967745 | 0.059 |
| 0.036614661290322606 | 0.067 |
| 0.036559112903225825 | 0.064 |
| 0.036559112903225825 | 0.064 |
| 0.036559112903225825 | 0.064 |
| 0.036292177419354865 | 0.057 |
| 0.03603146236559142 | 0.057 |
| 0.03591004301075271 | 0.063 |
| 0.0350251182795699 | 0.056 |
| 0.03456275806451615 | 0.059 |
| 0.03442527419354839 | 0.063 |
| 0.03368679569892471 | 0.074 |
| 0.033482435483870955 | 0.069 |
| 0.03329141935483871 | 0.069 |
| 0.03329141935483871 | 0.07 |
| 0.03301786021505377 | 0.069 |
| 0.0328403494623656 | 0.067 |
| 0.03158449462365592 | 0.071 |
| 0.03126541397849463 | 0.059 |
| 0.03126541397849463 | 0.059 |
| 0.028764607526881713 | 0.066 |
| 0.02814003763440862 | 0.07 |
| 0.02786051612903226 | 0.062 |
| 0.0278150752688172 | 0.07 |
| 0.02823995161290322 | 0.067 |
| 0.028346844086021505 | 0.069 |
| 0.028400935483870966 | 0.062 |
| 0.02867111827956988 | 0.069 |
| 0.02895737634408602 | 0.071 |
| 0.0291135376344086 | 0.071 |
| 0.029214935483870972 | 0.067 |
| 0.029255322580645164 | 0.07 |
| 0.02937195161290323 | 0.066 |
| 0.02967205913978497 | 0.065 |
| 0.02967205913978497 | 0.065 |
| 0.029680543010752698 | 0.064 |
| 0.029510967741935505 | 0.066 |
| 0.029445096774193564 | 0.066 |
| 0.02920690322580646 | 0.065 |
| 0.028281860215053783 | 0.07 |
| 0.028243548387096796 | 0.067 |
| 0.02795630645161291 | 0.068 |
| 0.027902682795698932 | 0.069 |
| 0.02770673655913978 | 0.062 |
| 0.02770673655913978 | 0.062 |
| 0.02562195161290321 | 0.069 |
| 0.02513830107526881 | 0.072 |
| 0.02506949999999999 | 0.07 |
| 0.025005215053763432 | 0.066 |
| 0.024802118279569893 | 0.077 |
| 0.02473506451612903 | 0.072 |
| 0.024736032258064512 | 0.073 |
| 0.024861225806451608 | 0.075 |
| 0.025137397849462364 | 0.076 |
| 0.025247344086021504 | 0.065 |
| 0.025247344086021504 | 0.065 |
| 0.025334758064516127 | 0.072 |
| 0.02539424193548387 | 0.07 |
| 0.025878478494623665 | 0.064 |
| 0.026347301075268826 | 0.079 |
| 0.026519220430107522 | 0.066 |
| 0.027707537634408592 | 0.067 |
| 0.027943526881720415 | 0.059 |
| 0.028161543010752684 | 0.067 |
| 0.028820215053763445 | 0.067 |
| 0.029083989247311835 | 0.068 |
| 0.02937614516129034 | 0.068 |
| 0.0294708172043011 | 0.067 |
| 0.029729811827957003 | 0.066 |
| 0.029786354838709683 | 0.071 |
| 0.029280999999999995 | 0.065 |
| 0.029219172043010746 | 0.068 |
| 0.02918491935483871 | 0.09 |
| 0.029156075268817198 | 0.073 |
| 0.029002575268817193 | 0.067 |
| 0.028982376344086014 | 0.073 |
| 0.028970999999999986 | 0.072 |
| 0.028577209677419342 | 0.066 |
| 0.028547048387096766 | 0.069 |
| 0.028493048387096764 | 0.064 |
| 0.02837980645161289 | 0.067 |
| 0.02825824193548386 | 0.07 |
| 0.028446553763440845 | 0.07 |
| 0.028446553763440845 | 0.07 |
| 0.028528290322580627 | 0.066 |
| 0.028746435483870972 | 0.061 |
| 0.02883037096774194 | 0.073 |
| 0.029057661290322605 | 0.066 |
| 0.029076564516129052 | 0.064 |
| 0.029128005376344107 | 0.066 |
| 0.02914488709677422 | 0.068 |
| 0.02953424731182797 | 0.064 |
| 0.029624741935483877 | 0.068 |
| 0.02971583870967742 | 0.058 |
| 0.029847731182795698 | 0.066 |
| 0.029874419354838713 | 0.064 |
| 0.0302423548387097 | 0.063 |
| 0.030268118279569923 | 0.07 |
| 0.030448500000000007 | 0.07 |
| 0.030468650537634416 | 0.07 |
| 0.03053565053763442 | 0.068 |
| 0.030557698924731203 | 0.067 |
| 0.030639930107526907 | 0.063 |
| 0.030639930107526907 | 0.071 |
| 0.030673430107526895 | 0.064 |
| 0.030673430107526895 | 0.064 |
| 0.030794629032258082 | 0.065 |
| 0.03093725806451614 | 0.067 |
| 0.03109374731182797 | 0.063 |
| 0.031102940860215065 | 0.065 |
| 0.031141306451612918 | 0.068 |
| 0.031216602150537637 | 0.066 |
| 0.031216602150537637 | 0.066 |
| 0.031419145161290324 | 0.066 |
| 0.031425655913978494 | 0.062 |
| 0.031433612903225806 | 0.065 |
| 0.031454268817204305 | 0.062 |
| 0.031452672043010756 | 0.062 |
| 0.03145133870967742 | 0.061 |
| 0.03145133870967742 | 0.061 |
| 0.031435166666666674 | 0.067 |
| 0.03138006451612904 | 0.066 |
| 0.031247263440860224 | 0.059 |
| 0.031233801075268817 | 0.066 |
| 0.03108076344086021 | 0.066 |
| 0.031047172043010746 | 0.065 |